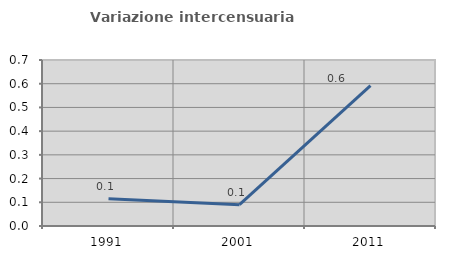
| Category | Variazione intercensuaria annua |
|---|---|
| 1991.0 | 0.115 |
| 2001.0 | 0.09 |
| 2011.0 | 0.592 |